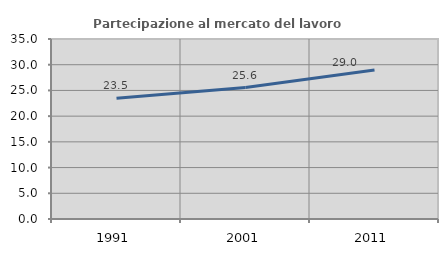
| Category | Partecipazione al mercato del lavoro  femminile |
|---|---|
| 1991.0 | 23.483 |
| 2001.0 | 25.566 |
| 2011.0 | 28.993 |